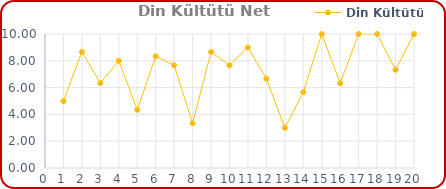
| Category | Din Kültütü |
|---|---|
| 0 | 5 |
| 1 | 8.667 |
| 2 | 6.333 |
| 3 | 8 |
| 4 | 4.333 |
| 5 | 8.333 |
| 6 | 7.667 |
| 7 | 3.333 |
| 8 | 8.667 |
| 9 | 7.667 |
| 10 | 9 |
| 11 | 6.667 |
| 12 | 3 |
| 13 | 5.667 |
| 14 | 10 |
| 15 | 6.333 |
| 16 | 10 |
| 17 | 10 |
| 18 | 7.333 |
| 19 | 10 |